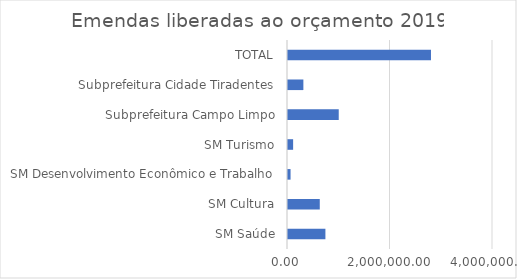
| Category | Series 0 |
|---|---|
| SM Saúde | 730000 |
| SM Cultura | 620000 |
| SM Desenvolvimento Econômico e Trabalho | 50000 |
| SM Turismo | 100000 |
| Subprefeitura Campo Limpo | 990000 |
| Subprefeitura Cidade Tiradentes | 300000 |
| TOTAL | 2790000 |